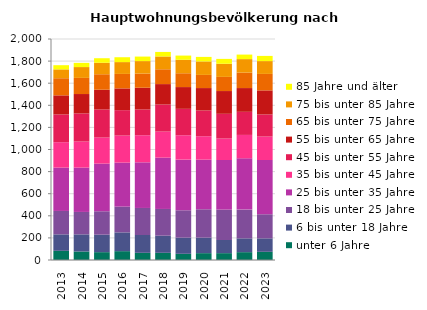
| Category | unter 6 Jahre | 6 bis unter 18 Jahre | 18 bis unter 25 Jahre | 25 bis unter 35 Jahre | 35 bis unter 45 Jahre | 45 bis unter 55 Jahre | 55 bis unter 65 Jahre | 65 bis unter 75 Jahre | 75 bis unter 85 Jahre | 85 Jahre und älter |
|---|---|---|---|---|---|---|---|---|---|---|
| 2013.0 | 83 | 149 | 212 | 392 | 230 | 251 | 173 | 155 | 80 | 38 |
| 2014.0 | 77 | 155 | 203 | 401 | 236 | 254 | 176 | 146 | 98 | 38 |
| 2015.0 | 71 | 158 | 212 | 431 | 236 | 254 | 179 | 140 | 104 | 41 |
| 2016.0 | 80 | 170 | 233 | 398 | 245 | 230 | 197 | 131 | 107 | 44 |
| 2017.0 | 65 | 161 | 245 | 413 | 245 | 233 | 197 | 128 | 113 | 41 |
| 2018.0 | 65 | 155 | 242 | 464 | 236 | 245 | 185 | 134 | 116 | 41 |
| 2019.0 | 56 | 146 | 248 | 458 | 221 | 239 | 197 | 125 | 122 | 38 |
| 2020.0 | 62 | 140 | 257 | 449 | 212 | 233 | 203 | 119 | 122 | 41 |
| 2021.0 | 62 | 119 | 275 | 449 | 194 | 224 | 206 | 128 | 119 | 44 |
| 2022.0 | 71 | 125 | 260 | 464 | 212 | 209 | 215 | 140 | 122 | 41 |
| 2023.0 | 74 | 122 | 218 | 491 | 212 | 200 | 218 | 149 | 116 | 47 |